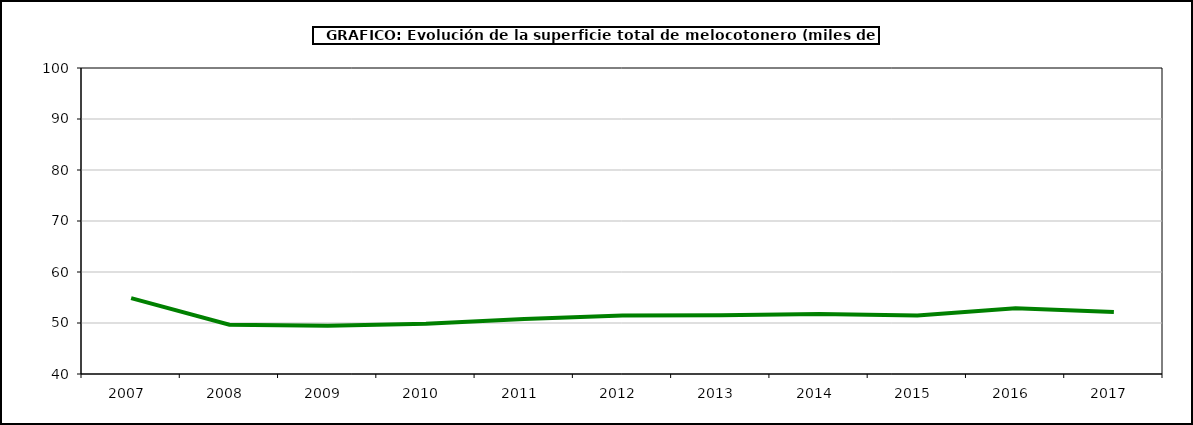
| Category | superficie melocotonero |
|---|---|
| 2007.0 | 54.887 |
| 2008.0 | 49.653 |
| 2009.0 | 49.441 |
| 2010.0 | 49.844 |
| 2011.0 | 50.805 |
| 2012.0 | 51.491 |
| 2013.0 | 51.511 |
| 2014.0 | 51.746 |
| 2015.0 | 51.458 |
| 2016.0 | 52.875 |
| 2017.0 | 52.141 |